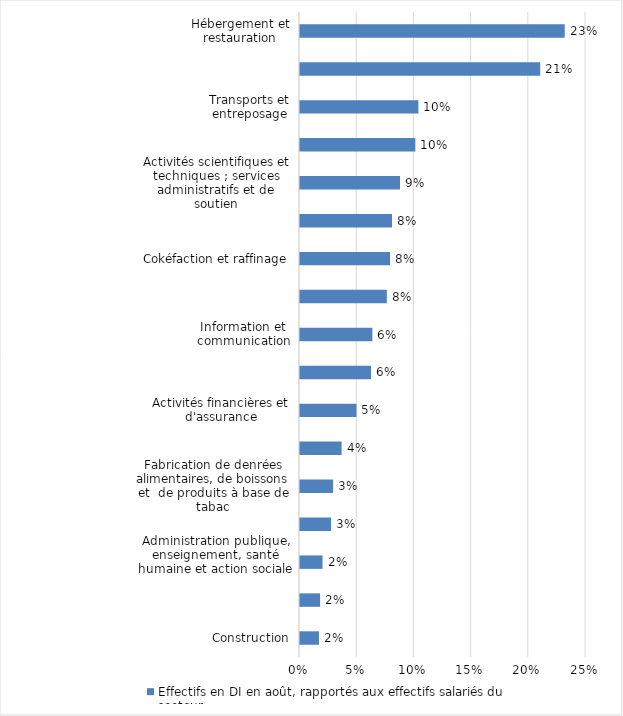
| Category | Effectifs en DI en août, rapportés aux effectifs salariés du secteur |
|---|---|
| Construction | 0.017 |
| Activités immobilières | 0.018 |
| Administration publique, enseignement, santé humaine et action sociale | 0.02 |
| Industries extractives,  énergie, eau, gestion des déchets et dépollution | 0.027 |
| Fabrication de denrées alimentaires, de boissons et  de produits à base de tabac | 0.029 |
| Commerce ; réparation d'automobiles et de motocycles | 0.036 |
| Activités financières et d'assurance | 0.049 |
| Fabrication d'autres produits industriels | 0.062 |
| Information et communication | 0.063 |
| Fabrication d'équipements électriques, électroniques, informatiques ; fabrication de machines | 0.076 |
| Cokéfaction et raffinage | 0.079 |
| Agriculture, sylviculture et pêche | 0.08 |
| Activités scientifiques et techniques ; services administratifs et de soutien | 0.087 |
| Autres activités de services | 0.101 |
| Transports et entreposage | 0.103 |
| Fabrication de matériels de transport | 0.21 |
| Hébergement et restauration | 0.231 |